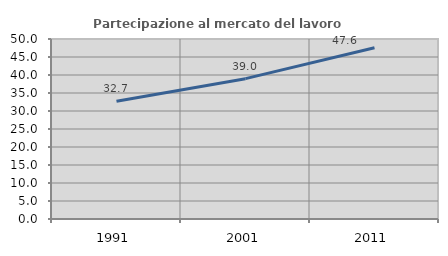
| Category | Partecipazione al mercato del lavoro  femminile |
|---|---|
| 1991.0 | 32.725 |
| 2001.0 | 38.984 |
| 2011.0 | 47.554 |